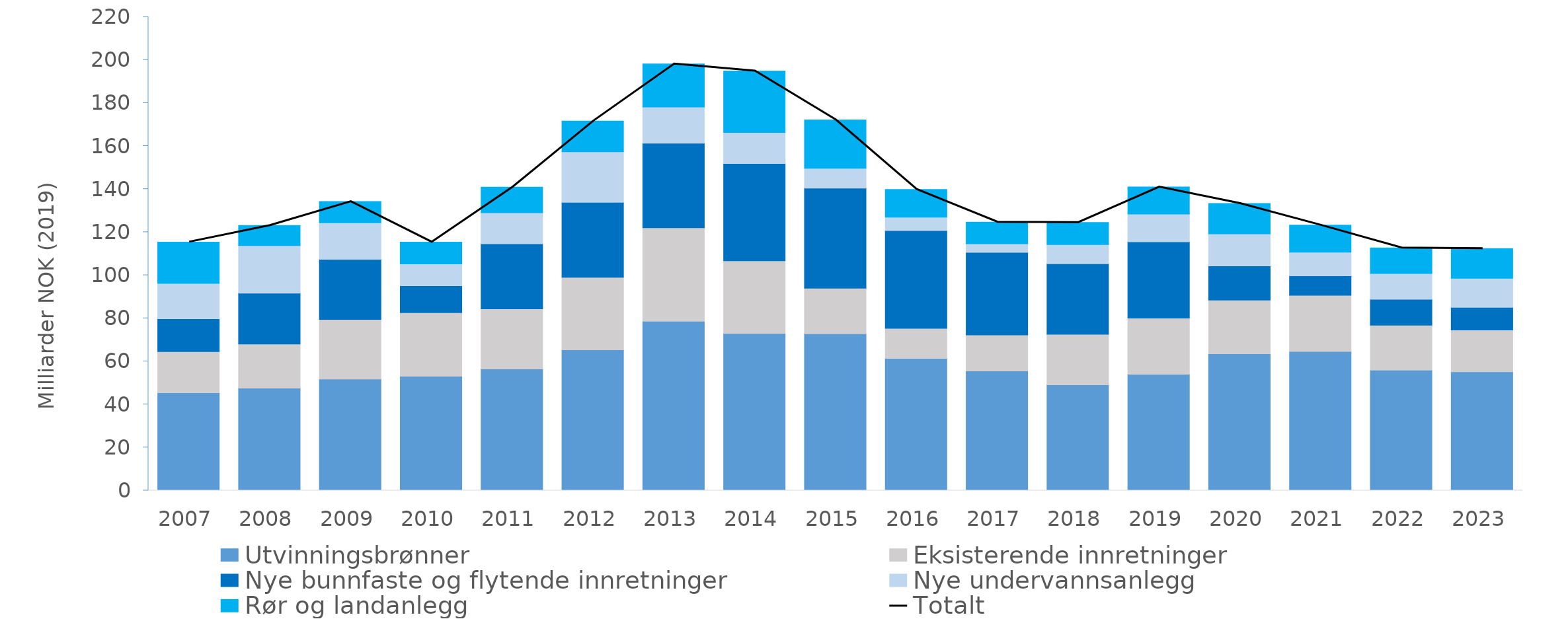
| Category | Utvinningsbrønner | Eksisterende innretninger | Nye bunnfaste og flytende innretninger | Nye undervannsanlegg | Rør og landanlegg |
|---|---|---|---|---|---|
| 2007.0 | 45.377 | 19.153 | 15.271 | 16.367 | 19.24 |
| 2008.0 | 47.521 | 20.557 | 23.575 | 22.12 | 9.339 |
| 2009.0 | 51.78 | 27.728 | 27.846 | 17.028 | 9.821 |
| 2010.0 | 53.069 | 29.558 | 12.507 | 10.099 | 10.147 |
| 2011.0 | 56.439 | 27.959 | 30.206 | 14.416 | 11.895 |
| 2012.0 | 65.343 | 33.717 | 34.815 | 23.48 | 14.278 |
| 2013.0 | 78.618 | 43.434 | 39.296 | 16.792 | 19.988 |
| 2014.0 | 72.963 | 33.727 | 45.227 | 14.424 | 28.506 |
| 2015.0 | 72.785 | 21.207 | 46.452 | 9.249 | 22.428 |
| 2016.0 | 61.386 | 13.934 | 45.391 | 6.24 | 12.9 |
| 2017.0 | 55.537 | 16.704 | 38.38 | 3.949 | 10.118 |
| 2018.0 | 49.107 | 23.421 | 32.806 | 8.861 | 10.34 |
| 2019.0 | 54.035 | 26.015 | 35.468 | 12.926 | 12.516 |
| 2020.0 | 63.517 | 24.911 | 15.907 | 14.859 | 14.113 |
| 2021.0 | 64.597 | 26.066 | 9.092 | 10.944 | 12.545 |
| 2022.0 | 55.946 | 20.846 | 12.068 | 11.927 | 11.894 |
| 2023.0 | 55.173 | 19.364 | 10.496 | 13.543 | 13.822 |